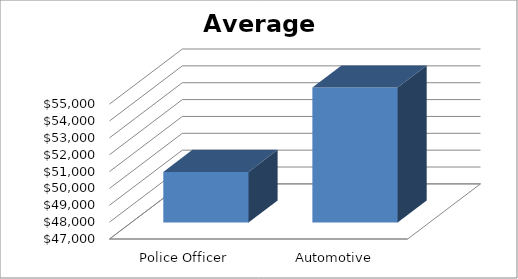
| Category | Average Salary |
|---|---|
| Police Officer | 50000 |
| Automotive Technician | 55000 |